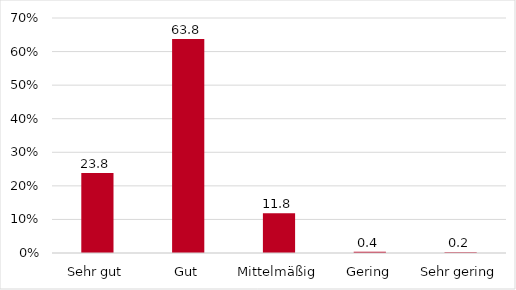
| Category | Series 0 |
|---|---|
| Sehr gut | 23.819 |
| Gut | 63.78 |
| Mittelmäßig | 11.811 |
| Gering | 0.394 |
| Sehr gering | 0.197 |